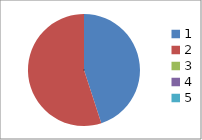
| Category | Series 0 |
|---|---|
| 0 | 0.45 |
| 1 | 0.55 |
| 2 | 0 |
| 3 | 0 |
| 4 | 0 |